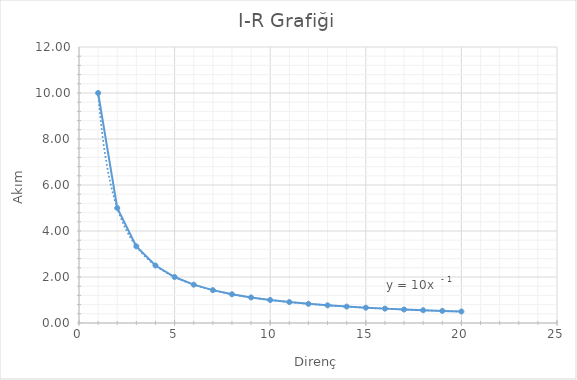
| Category | Akım (A) |
|---|---|
| 1.0 | 10 |
| 2.0 | 5 |
| 3.0 | 3.333 |
| 4.0 | 2.5 |
| 5.0 | 2 |
| 6.0 | 1.667 |
| 7.0 | 1.429 |
| 8.0 | 1.25 |
| 9.0 | 1.111 |
| 10.0 | 1 |
| 11.0 | 0.909 |
| 12.0 | 0.833 |
| 13.0 | 0.769 |
| 14.0 | 0.714 |
| 15.0 | 0.667 |
| 16.0 | 0.625 |
| 17.0 | 0.588 |
| 18.0 | 0.556 |
| 19.0 | 0.526 |
| 20.0 | 0.5 |